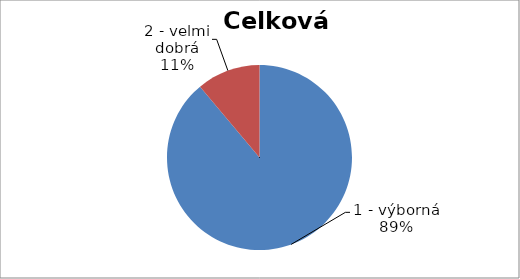
| Category | Celkem |
|---|---|
| 1 - výborná | 24 |
| 2 - velmi dobrá | 3 |